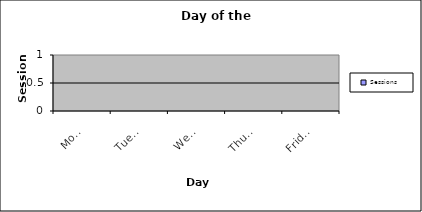
| Category | Sessions |
|---|---|
| Monday | 0 |
| Tuesday | 0 |
| Wednesday | 0 |
| Thursday | 0 |
| Friday | 0 |